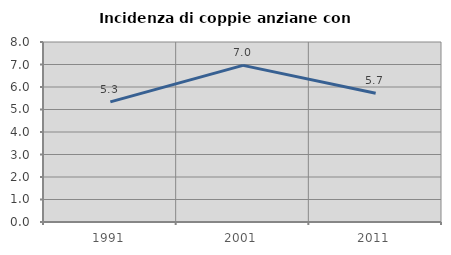
| Category | Incidenza di coppie anziane con figli |
|---|---|
| 1991.0 | 5.338 |
| 2001.0 | 6.96 |
| 2011.0 | 5.725 |